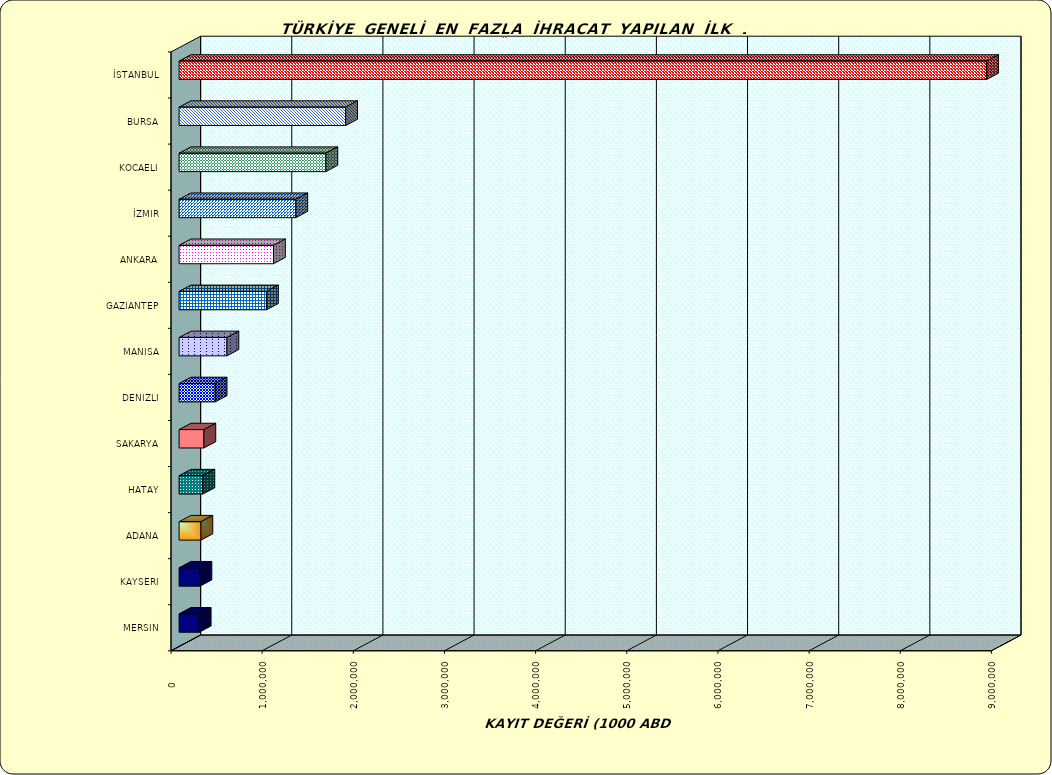
| Category | Series 0 |
|---|---|
| İSTANBUL | 8859844.661 |
| BURSA | 1827262.978 |
| KOCAELI | 1610679.388 |
| İZMIR | 1280923.909 |
| ANKARA | 1035751.666 |
| GAZIANTEP | 959114.881 |
| MANISA | 525167.784 |
| DENIZLI | 396117.51 |
| SAKARYA | 272292.482 |
| HATAY | 261197.619 |
| ADANA | 239677.742 |
| KAYSERI | 229203.082 |
| MERSIN | 221026.183 |